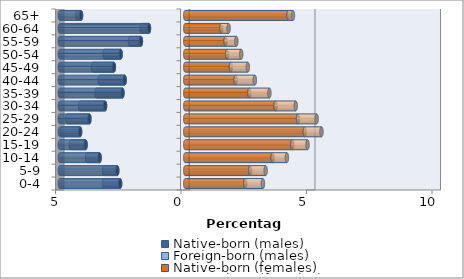
| Category | Native-born (males) | Foreign-born (males) | Native-born (females) | Foreign-born (females) |
|---|---|---|---|---|
| 0-4 | -2.595 | -0.637 | 2.391 | 0.704 |
| 5-9 | -2.708 | -0.524 | 2.591 | 0.613 |
| 10-14 | -3.411 | -0.5 | 3.482 | 0.568 |
| 15-19 | -3.969 | -0.591 | 4.265 | 0.606 |
| 20-24 | -4.189 | -0.724 | 4.763 | 0.664 |
| 25-29 | -3.819 | -0.875 | 4.492 | 0.744 |
| 30-34 | -3.195 | -0.997 | 3.599 | 0.802 |
| 35-39 | -2.501 | -1.037 | 2.555 | 0.797 |
| 40-44 | -2.414 | -0.993 | 2.007 | 0.766 |
| 45-49 | -2.844 | -0.832 | 1.819 | 0.675 |
| 50-54 | -2.574 | -0.637 | 1.668 | 0.561 |
| 55-59 | -1.767 | -0.438 | 1.607 | 0.43 |
| 60-64 | -1.445 | -0.296 | 1.442 | 0.287 |
| 65+ | -4.152 | -0.149 | 4.117 | 0.175 |